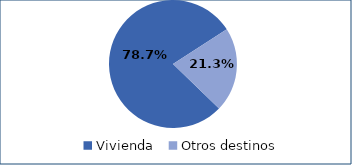
| Category | Series 0 |
|---|---|
| Vivienda | 0.787 |
| Otros destinos | 0.213 |